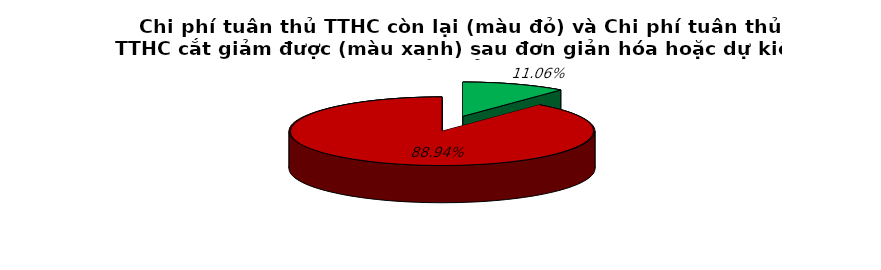
| Category | 11.1% 88.9% |
|---|---|
| 0 | 0.111 |
| 1 | 0.889 |